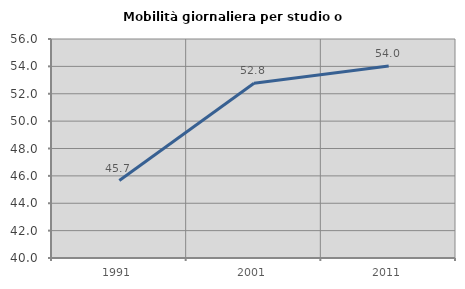
| Category | Mobilità giornaliera per studio o lavoro |
|---|---|
| 1991.0 | 45.658 |
| 2001.0 | 52.77 |
| 2011.0 | 54.023 |